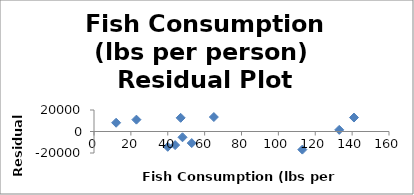
| Category | Series 0 |
|---|---|
| 23.0 | 11019.985 |
| 53.0 | -10761.166 |
| 48.0 | -5366.89 |
| 141.0 | 12986.859 |
| 12.0 | 8149.96 |
| 113.0 | -16837.706 |
| 65.0 | 13455.127 |
| 133.0 | 1516.622 |
| 44.0 | -12649.478 |
| 47.0 | 12717.502 |
| 40.0 | -14230.815 |